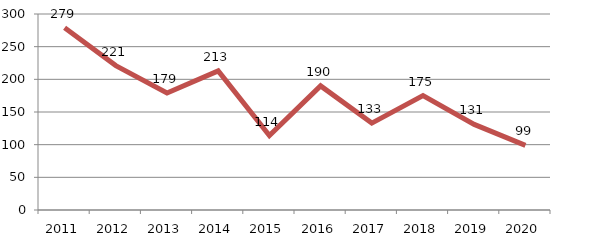
| Category | Total |
|---|---|
| 2011.0 | 279 |
| 2012.0 | 221 |
| 2013.0 | 179 |
| 2014.0 | 213 |
| 2015.0 | 114 |
| 2016.0 | 190 |
| 2017.0 | 133 |
| 2018.0 | 175 |
| 2019.0 | 131 |
| 2020.0 | 99 |